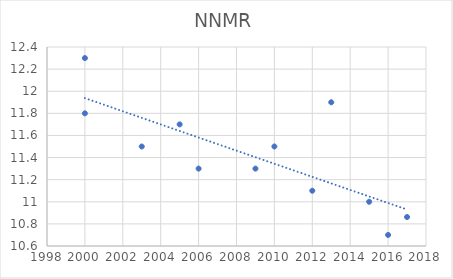
| Category | NNMR |
|---|---|
| 2000.0 | 12.3 |
| 2000.0 | 11.8 |
| 2003.0 | 11.5 |
| 2005.0 | 11.7 |
| 2006.0 | 11.3 |
| 2009.0 | 11.3 |
| 2010.0 | 11.5 |
| 2012.0 | 11.1 |
| 2013.0 | 11.9 |
| 2015.0 | 11 |
| 2016.0 | 10.7 |
| 2017.0 | 10.862 |